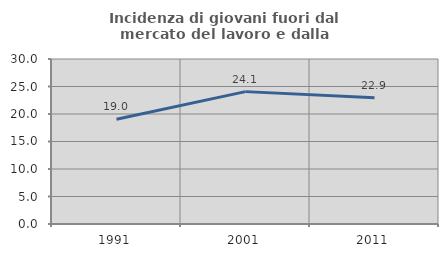
| Category | Incidenza di giovani fuori dal mercato del lavoro e dalla formazione  |
|---|---|
| 1991.0 | 19.045 |
| 2001.0 | 24.068 |
| 2011.0 | 22.944 |